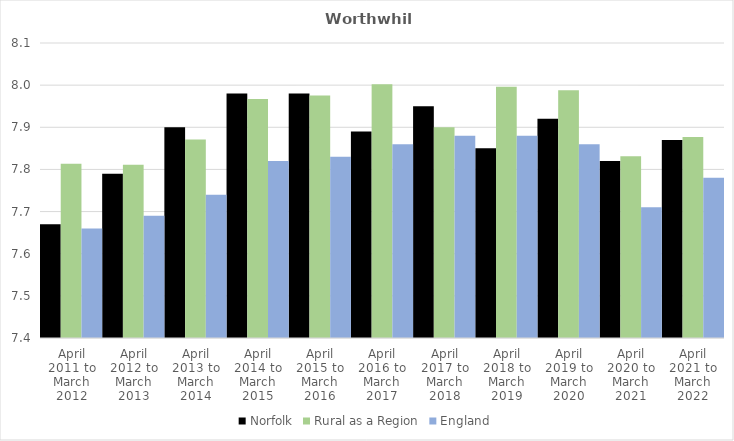
| Category | Norfolk | Rural as a Region | England |
|---|---|---|---|
| April 2011 to March 2012 | 7.67 | 7.813 | 7.66 |
| April 2012 to March 2013 | 7.79 | 7.811 | 7.69 |
| April 2013 to March 2014 | 7.9 | 7.871 | 7.74 |
| April 2014 to March 2015 | 7.98 | 7.967 | 7.82 |
| April 2015 to March 2016 | 7.98 | 7.975 | 7.83 |
| April 2016 to March 2017 | 7.89 | 8.002 | 7.86 |
| April 2017 to March 2018 | 7.95 | 7.9 | 7.88 |
| April 2018 to March 2019 | 7.85 | 7.996 | 7.88 |
| April 2019 to March 2020 | 7.92 | 7.988 | 7.86 |
| April 2020 to March 2021 | 7.82 | 7.831 | 7.71 |
| April 2021 to March 2022 | 7.87 | 7.877 | 7.78 |